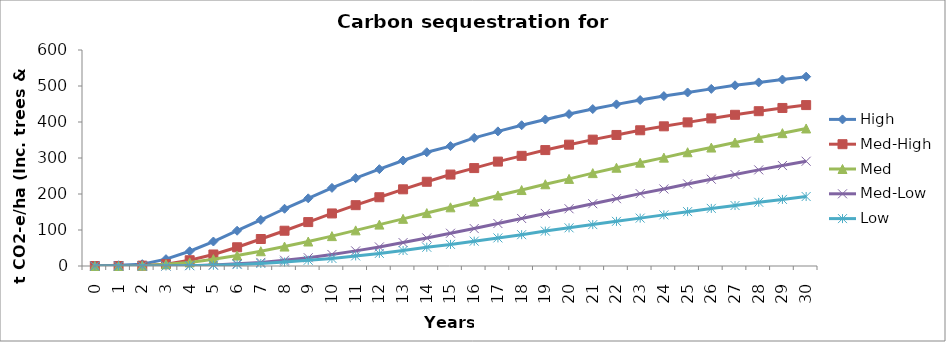
| Category | High | Med-High | Med | Med-Low | Low |
|---|---|---|---|---|---|
| 0.0 | 0 | 0 | 0 | 0 | 0 |
| 1.0 | 2 | 0 | 0 | 0 | 0 |
| 2.0 | 5 | 1 | 1 | 0 | 0 |
| 3.0 | 19 | 5 | 5 | 0 | 0 |
| 4.0 | 41 | 16 | 10 | 1 | 1 |
| 5.0 | 68 | 32 | 19 | 3 | 2 |
| 6.0 | 98 | 52 | 29 | 6 | 4 |
| 7.0 | 128 | 75 | 41 | 10 | 7 |
| 8.0 | 159 | 98 | 54 | 16 | 11 |
| 9.0 | 188 | 122 | 68 | 23 | 16 |
| 10.0 | 217 | 146 | 83 | 32 | 21 |
| 11.0 | 244 | 169 | 99 | 42 | 28 |
| 12.0 | 269 | 191 | 115 | 53 | 35 |
| 13.0 | 293 | 213 | 131 | 65 | 43 |
| 14.0 | 316 | 234 | 147 | 78 | 52 |
| 15.0 | 333 | 254 | 163 | 91 | 60 |
| 16.0 | 356 | 272 | 179 | 104 | 69 |
| 17.0 | 374 | 290 | 196 | 118 | 78 |
| 18.0 | 391 | 306 | 211 | 132 | 87 |
| 19.0 | 407 | 322 | 227 | 146 | 97 |
| 20.0 | 422 | 337 | 242 | 159 | 106 |
| 21.0 | 436 | 351 | 258 | 173 | 115 |
| 22.0 | 449 | 364 | 273 | 187 | 124 |
| 23.0 | 461 | 377 | 287 | 201 | 133 |
| 24.0 | 472 | 388 | 301 | 214 | 142 |
| 25.0 | 482 | 399 | 316 | 228 | 151 |
| 26.0 | 492 | 410 | 329 | 241 | 160 |
| 27.0 | 502 | 420 | 343 | 254 | 168 |
| 28.0 | 510 | 430 | 356 | 267 | 177 |
| 29.0 | 518 | 439 | 369 | 279 | 185 |
| 30.0 | 526 | 447 | 382 | 291 | 193 |